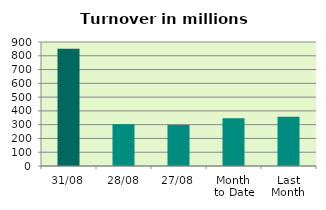
| Category | Series 0 |
|---|---|
| 31/08 | 851.019 |
| 28/08 | 303.435 |
| 27/08 | 298.78 |
| Month 
to Date | 347.074 |
| Last
Month | 357.784 |